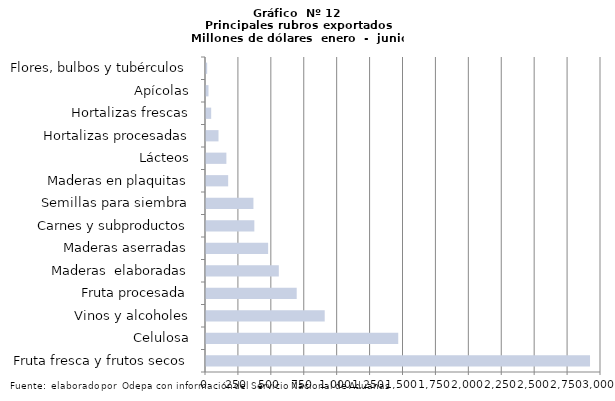
| Category | Series 7 |
|---|---|
| Fruta fresca y frutos secos | 2916504.968 |
| Celulosa | 1459960.275 |
| Vinos y alcoholes | 901564.238 |
| Fruta procesada | 688939.128 |
| Maderas  elaboradas | 553032.7 |
| Maderas aserradas | 471729.083 |
| Carnes y subproductos | 367090.281 |
| Semillas para siembra | 360173.741 |
| Maderas en plaquitas | 168305.001 |
| Lácteos | 154764.089 |
| Hortalizas procesadas | 94971.577 |
| Hortalizas frescas | 39303.545 |
| Apícolas | 18886.966 |
| Flores, bulbos y tubérculos | 8901.532 |